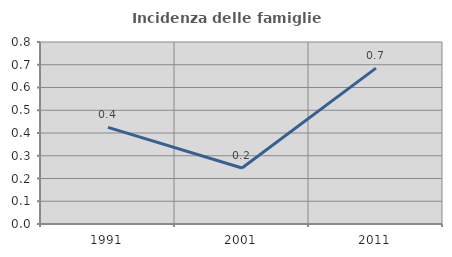
| Category | Incidenza delle famiglie numerose |
|---|---|
| 1991.0 | 0.425 |
| 2001.0 | 0.246 |
| 2011.0 | 0.685 |